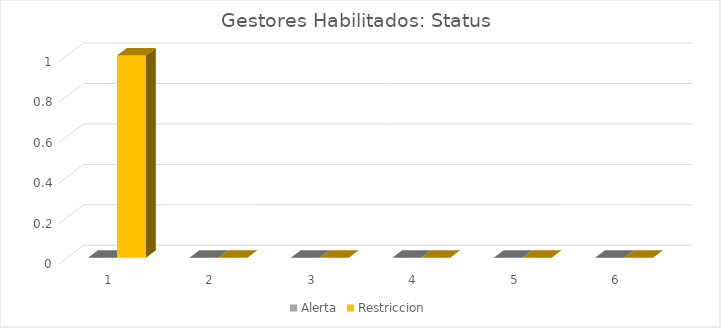
| Category | Avance | Alerta | Restriccion |
|---|---|---|---|
| 0 |  | 0 | 1 |
| 1 |  | 0 | 0 |
| 2 |  | 0 | 0 |
| 3 |  | 0 | 0 |
| 4 |  | 0 | 0 |
| 5 |  | 0 | 0 |